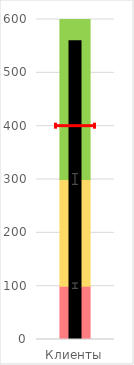
| Category | Плохо | Средне | Хорошо |
|---|---|---|---|
| Клиенты | 100 | 200 | 300 |